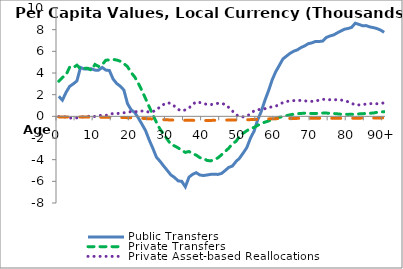
| Category | Public Transfers | Private Transfers | Private Asset-based Reallocations | Public Asset-based Reallocations |
|---|---|---|---|---|
| 0 | 1840.185 | 3240.183 | -25.581 | -53.946 |
|  | 1497.806 | 3589.114 | -46.035 | -54.325 |
| 2 | 2209.512 | 3817.072 | -53.331 | -55.542 |
| 3 | 2764 | 4538.881 | -157.203 | -57.218 |
| 4 | 2995.894 | 4490.077 | -134.638 | -59.191 |
| 5 | 3265.876 | 4721.441 | -144.42 | -61.473 |
| 6 | 4511.524 | 4375.781 | -65.51 | -63.838 |
| 7 | 4363.206 | 4441.336 | -45.15 | -66.531 |
| 8 | 4359.807 | 4440.087 | -25.524 | -69.631 |
| 9 | 4391.845 | 4258.947 | 54.191 | -73.019 |
| 10 | 4265.433 | 4789.084 | -24.501 | -76.677 |
| 11 | 4263.005 | 4606.753 | 76.134 | -80.391 |
| 12 | 4514.578 | 4768.522 | 98.578 | -83.999 |
| 13 | 4269.953 | 5178.111 | 79.395 | -87.582 |
| 14 | 4226.382 | 5208.237 | 176.293 | -91.186 |
| 15 | 3452.238 | 5251.663 | 263.043 | -95.28 |
| 16 | 3031.16 | 5201.664 | 241.022 | -101.665 |
| 17 | 2783.817 | 5088.149 | 310.001 | -107.368 |
| 18 | 2426.422 | 4864.375 | 330.023 | -113.865 |
| 19 | 1170.928 | 4588.974 | 394.536 | -121.419 |
| 20 | 609.824 | 4038.846 | 424.196 | -130.692 |
| 21 | 353.224 | 3631.474 | 397.899 | -141.995 |
| 22 | -151.388 | 3045.73 | 488.648 | -165.503 |
| 23 | -729.06 | 2369.666 | 488.104 | -183.179 |
| 24 | -1319.829 | 1636.114 | 480.92 | -202.172 |
| 25 | -2184.694 | 887.633 | 375.016 | -223.987 |
| 26 | -2939.722 | 152.085 | 429.553 | -247.218 |
| 27 | -3771.01 | -554.434 | 586.458 | -268.355 |
| 28 | -4149.563 | -1190.668 | 876.525 | -288.106 |
| 29 | -4583.566 | -1631.692 | 1096.704 | -306.191 |
| 30 | -4989.535 | -2119.15 | 1263.42 | -322.202 |
| 31 | -5411.492 | -2589.901 | 1182.242 | -337.751 |
| 32 | -5640.258 | -2729.946 | 935.012 | -351.457 |
| 33 | -5961.804 | -2908.534 | 637.974 | -362.799 |
| 34 | -5999.613 | -3147.392 | 505.332 | -369.054 |
| 35 | -6506.324 | -3330.152 | 590.446 | -369.643 |
| 36 | -5620.235 | -3244.901 | 762.57 | -369.305 |
| 37 | -5354.82 | -3444.456 | 1093.771 | -369.618 |
| 38 | -5201.95 | -3577.559 | 1346.507 | -372.555 |
| 39 | -5412.43 | -3811.748 | 1276.269 | -378.856 |
| 40 | -5465.155 | -3884.304 | 1168.899 | -383.146 |
| 41 | -5413.859 | -4069.593 | 1106.96 | -381.814 |
| 42 | -5356.705 | -4112.664 | 1068.325 | -376.858 |
| 43 | -5351.883 | -3994.005 | 1160.308 | -367.469 |
| 44 | -5359.853 | -3835.724 | 1198.017 | -358.525 |
| 45 | -5274.392 | -3554.432 | 1189.92 | -352.356 |
| 46 | -5006.04 | -3243.695 | 1103.568 | -347.588 |
| 47 | -4712.44 | -2943.524 | 819.754 | -345.389 |
| 48 | -4592.364 | -2528.803 | 498.468 | -343.678 |
| 49 | -4179.79 | -2311.093 | 155.546 | -340.422 |
| 50 | -3855.607 | -1857.397 | -17.531 | -334.791 |
| 51 | -3384.352 | -1558.54 | -48.033 | -326.457 |
| 52 | -2886.434 | -1332.715 | 16.577 | -316.739 |
| 53 | -2023.689 | -1118.84 | 217.802 | -303.182 |
| 54 | -1376.418 | -1024.224 | 507.813 | -288.525 |
| 55 | -326.576 | -833.791 | 610.887 | -272.249 |
| 56 | 450.337 | -657.939 | 649.987 | -259.365 |
| 57 | 1465.019 | -537.167 | 704.229 | -245.637 |
| 58 | 2355.762 | -430.717 | 807.116 | -234.459 |
| 59 | 3355.498 | -275.468 | 880.536 | -224.074 |
| 60 | 4118.371 | -211.028 | 942.305 | -214.323 |
| 61 | 4707.486 | -87.015 | 1091.911 | -205.313 |
| 62 | 5301.913 | -37.407 | 1274.201 | -197.764 |
| 63 | 5565.544 | 68.218 | 1371.851 | -192.605 |
| 64 | 5825.078 | 140.716 | 1425.978 | -192.555 |
| 65 | 6013.971 | 203.234 | 1450.536 | -192.907 |
| 66 | 6138.971 | 245.218 | 1459.023 | -188.055 |
| 67 | 6353.039 | 265.633 | 1472.643 | -184.654 |
| 68 | 6500.081 | 294.362 | 1436.705 | -180.874 |
| 69 | 6705.522 | 279.09 | 1383.962 | -177.411 |
| 70 | 6782.094 | 265.128 | 1384.111 | -174.719 |
| 71 | 6913.535 | 263.076 | 1425.391 | -173.163 |
| 72 | 6906.641 | 292.885 | 1486.513 | -174.055 |
| 73 | 6950.027 | 301.083 | 1559.573 | -175.559 |
| 74 | 7280.856 | 299.594 | 1584.894 | -177.473 |
| 75 | 7418.479 | 282.155 | 1529.485 | -179.658 |
| 76 | 7509.26 | 261.542 | 1517.719 | -181.364 |
| 77 | 7700.316 | 232.734 | 1543.924 | -181.304 |
| 78 | 7873.241 | 196.353 | 1509.372 | -180.108 |
| 79 | 8045.547 | 182.878 | 1453.221 | -178.847 |
| 80 | 8106.45 | 180.338 | 1343.877 | -176.498 |
| 81 | 8218.303 | 183.937 | 1203.533 | -173.941 |
| 82 | 8595.545 | 199.407 | 1051.942 | -171.019 |
| 83 | 8485.435 | 224.85 | 1052.183 | -167.456 |
| 84 | 8365.797 | 243.495 | 1070.369 | -164.16 |
| 85 | 8374.305 | 263.079 | 1135.52 | -160.612 |
| 86 | 8257.466 | 283.975 | 1164.588 | -157.161 |
| 87 | 8190.26 | 306.415 | 1184.891 | -153.494 |
| 88 | 8101.401 | 370.565 | 1161.373 | -149.559 |
| 89 | 7960.415 | 402.938 | 1189.748 | -145.6 |
| 90+ | 7758.38 | 432.208 | 1241.949 | -139.483 |